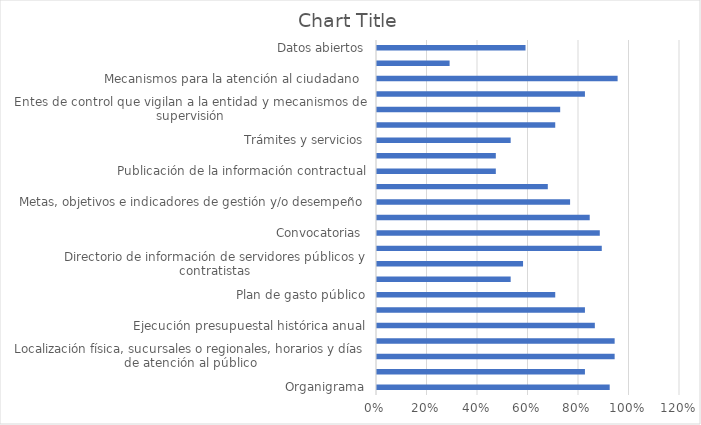
| Category | Series 0 |
|---|---|
| Organigrama | 0.922 |
| Funciones y deberes | 0.824 |
| Localización física, sucursales o regionales, horarios y días de atención al público | 0.941 |
| Presupuesto general asignado | 0.941 |
| Ejecución presupuestal histórica anual | 0.863 |
| Estados financieros | 0.824 |
| Plan de gasto público | 0.706 |
| Plan Anual de Adquisiciones | 0.529 |
| Directorio de información de servidores públicos y contratistas | 0.578 |
| Normatividad del orden nacional  | 0.89 |
| Convocatorias  | 0.882 |
| Políticas, lineamientos y manuales | 0.842 |
| Metas, objetivos e indicadores de gestión y/o desempeño | 0.765 |
| Informes de gestión, evaluación y auditoría | 0.676 |
| Publicación de la información contractual | 0.471 |
| Publicación de la ejecución de contratos | 0.471 |
| Trámites y servicios | 0.529 |
| Procesos y procedimientos | 0.706 |
| Entes de control que vigilan a la entidad y mecanismos de supervisión | 0.725 |
| Publicación de procedimientos, lineamientos y políticas en materia de adquisición y compras | 0.824 |
| Mecanismos para la atención al ciudadano  | 0.953 |
| Registro de Activos de Información | 0.288 |
| Datos abiertos | 0.588 |